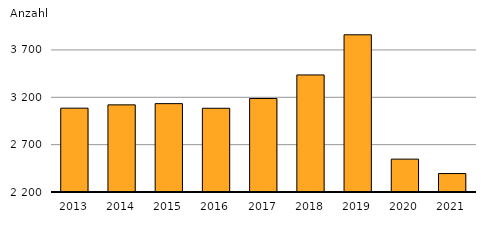
| Category | Series 0 |
|---|---|
| 2013.0 | 3085 |
| 2014.0 | 3120 |
| 2015.0 | 3133 |
| 2016.0 | 3084 |
| 2017.0 | 3187 |
| 2018.0 | 3436 |
| 2019.0 | 3860 |
| 2020.0 | 2547 |
| 2021.0 | 2395 |